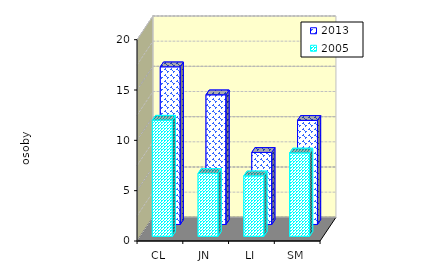
| Category | 2013 | 2005 |
|---|---|---|
| CL | 15.662 | 11.54 |
| JN | 12.88 | 6.249 |
| LI | 7.156 | 6.007 |
| SM | 10.341 | 8.277 |